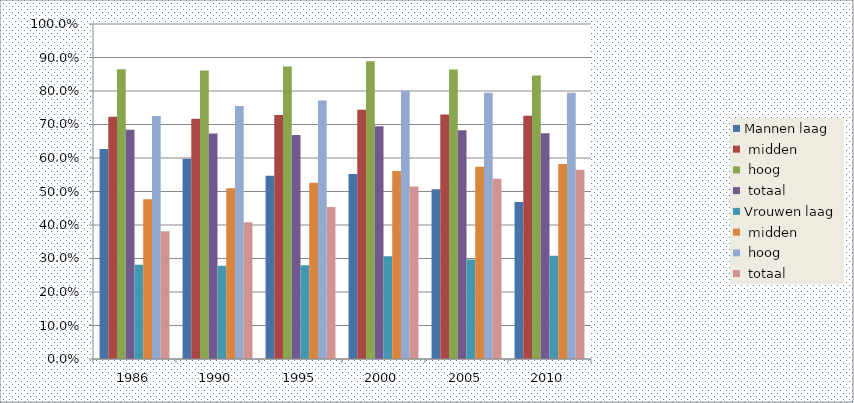
| Category | Mannen laag | Mannen midden | Mannen hoog | Mannen totaal | Vrouwen laag | Vrouwen midden | Vrouwen hoog | Vrouwen totaal |
|---|---|---|---|---|---|---|---|---|
| 1986.0 | 0.627 | 0.723 | 0.865 | 0.684 | 0.281 | 0.477 | 0.725 | 0.381 |
| 1990.0 | 0.598 | 0.717 | 0.861 | 0.673 | 0.278 | 0.51 | 0.755 | 0.408 |
| 1995.0 | 0.547 | 0.728 | 0.873 | 0.669 | 0.28 | 0.526 | 0.772 | 0.454 |
| 2000.0 | 0.552 | 0.744 | 0.889 | 0.695 | 0.307 | 0.561 | 0.801 | 0.515 |
| 2005.0 | 0.507 | 0.73 | 0.864 | 0.683 | 0.297 | 0.574 | 0.795 | 0.538 |
| 2010.0 | 0.469 | 0.726 | 0.846 | 0.674 | 0.308 | 0.582 | 0.795 | 0.565 |